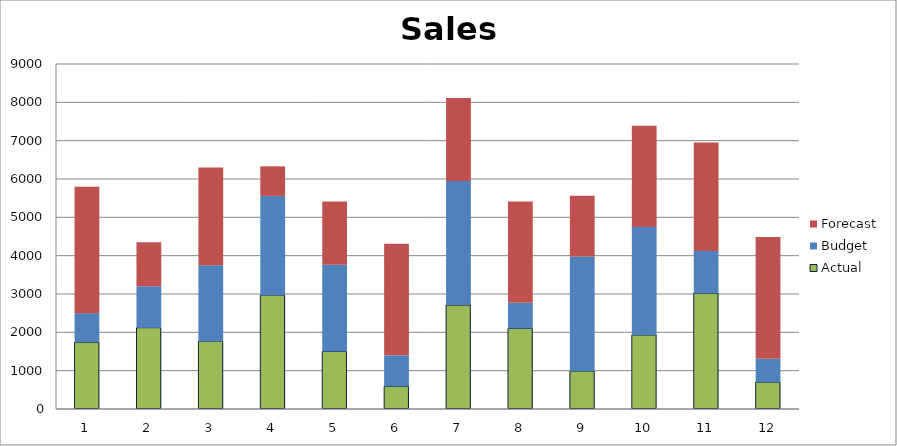
| Category | Actual | Budget | Forecast |
|---|---|---|---|
| 0 | 1740 | 760 | 3300 |
| 1 | 2120 | 1080 | 1150 |
| 2 | 1770 | 1980 | 2550 |
| 3 | 2970 | 2590 | 770 |
| 4 | 1500 | 2260 | 1650 |
| 5 | 590 | 810 | 2910 |
| 6 | 2710 | 3240 | 2160 |
| 7 | 2100 | 670 | 2640 |
| 8 | 990 | 2990 | 1580 |
| 9 | 1930 | 2820 | 2640 |
| 10 | 3020 | 1100 | 2830 |
| 11 | 700 | 610 | 3180 |